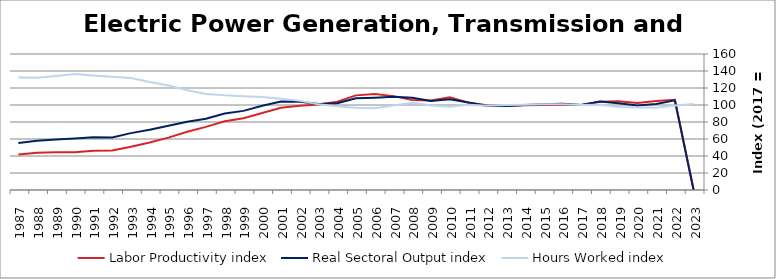
| Category | Labor Productivity index | Real Sectoral Output index | Hours Worked index |
|---|---|---|---|
| 2023.0 | 0 | 0 | 101.296 |
| 2022.0 | 106.11 | 105.474 | 99.401 |
| 2021.0 | 104.607 | 101.263 | 96.803 |
| 2020.0 | 102.424 | 99.532 | 97.177 |
| 2019.0 | 104.512 | 102.195 | 97.783 |
| 2018.0 | 103.697 | 104.125 | 100.413 |
| 2017.0 | 100 | 100 | 100 |
| 2016.0 | 100.347 | 101.343 | 100.993 |
| 2015.0 | 99.921 | 100.88 | 100.96 |
| 2014.0 | 99.73 | 100.109 | 100.38 |
| 2013.0 | 98.694 | 98.707 | 100.013 |
| 2012.0 | 99.688 | 98.949 | 99.259 |
| 2011.0 | 102.691 | 102.976 | 100.277 |
| 2010.0 | 109.108 | 106.759 | 97.847 |
| 2009.0 | 105.241 | 104.664 | 99.452 |
| 2008.0 | 105.871 | 108.56 | 102.54 |
| 2007.0 | 110.443 | 109.795 | 99.413 |
| 2006.0 | 112.808 | 108.598 | 96.268 |
| 2005.0 | 111.325 | 107.854 | 96.882 |
| 2004.0 | 103.752 | 102.114 | 98.421 |
| 2003.0 | 100.528 | 101.278 | 100.747 |
| 2002.0 | 99.079 | 103.881 | 104.846 |
| 2001.0 | 96.744 | 103.993 | 107.494 |
| 2000.0 | 90.601 | 99.066 | 109.343 |
| 1999.0 | 84.375 | 93.095 | 110.334 |
| 1998.0 | 80.854 | 90.027 | 111.344 |
| 1997.0 | 74.265 | 83.932 | 113.016 |
| 1996.0 | 68.513 | 80.397 | 117.347 |
| 1995.0 | 61.576 | 75.646 | 122.85 |
| 1994.0 | 55.789 | 70.929 | 127.138 |
| 1993.0 | 50.798 | 66.925 | 131.748 |
| 1992.0 | 46.4 | 61.841 | 133.279 |
| 1991.0 | 46.063 | 62.005 | 134.609 |
| 1990.0 | 44.436 | 60.67 | 136.533 |
| 1989.0 | 44.325 | 59.488 | 134.21 |
| 1988.0 | 43.95 | 58.019 | 132.01 |
| 1987.0 | 41.835 | 55.333 | 132.265 |